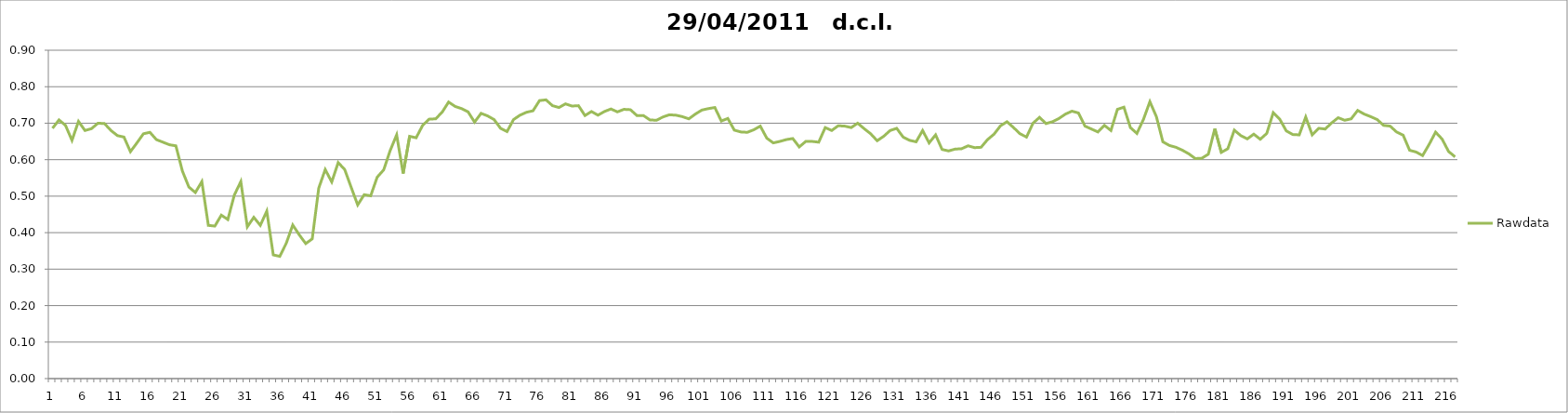
| Category | Rawdata |
|---|---|
| 0 | 0.686 |
| 1 | 0.709 |
| 2 | 0.694 |
| 3 | 0.653 |
| 4 | 0.705 |
| 5 | 0.68 |
| 6 | 0.685 |
| 7 | 0.7 |
| 8 | 0.699 |
| 9 | 0.68 |
| 10 | 0.666 |
| 11 | 0.662 |
| 12 | 0.622 |
| 13 | 0.646 |
| 14 | 0.671 |
| 15 | 0.675 |
| 16 | 0.655 |
| 17 | 0.648 |
| 18 | 0.641 |
| 19 | 0.638 |
| 20 | 0.569 |
| 21 | 0.525 |
| 22 | 0.51 |
| 23 | 0.54 |
| 24 | 0.42 |
| 25 | 0.418 |
| 26 | 0.448 |
| 27 | 0.436 |
| 28 | 0.503 |
| 29 | 0.54 |
| 30 | 0.416 |
| 31 | 0.442 |
| 32 | 0.42 |
| 33 | 0.459 |
| 34 | 0.339 |
| 35 | 0.335 |
| 36 | 0.371 |
| 37 | 0.421 |
| 38 | 0.394 |
| 39 | 0.37 |
| 40 | 0.383 |
| 41 | 0.522 |
| 42 | 0.573 |
| 43 | 0.539 |
| 44 | 0.592 |
| 45 | 0.573 |
| 46 | 0.524 |
| 47 | 0.476 |
| 48 | 0.504 |
| 49 | 0.501 |
| 50 | 0.552 |
| 51 | 0.572 |
| 52 | 0.625 |
| 53 | 0.668 |
| 54 | 0.562 |
| 55 | 0.664 |
| 56 | 0.66 |
| 57 | 0.694 |
| 58 | 0.711 |
| 59 | 0.712 |
| 60 | 0.73 |
| 61 | 0.758 |
| 62 | 0.746 |
| 63 | 0.74 |
| 64 | 0.731 |
| 65 | 0.703 |
| 66 | 0.727 |
| 67 | 0.72 |
| 68 | 0.71 |
| 69 | 0.686 |
| 70 | 0.677 |
| 71 | 0.71 |
| 72 | 0.722 |
| 73 | 0.73 |
| 74 | 0.734 |
| 75 | 0.762 |
| 76 | 0.764 |
| 77 | 0.748 |
| 78 | 0.743 |
| 79 | 0.753 |
| 80 | 0.747 |
| 81 | 0.748 |
| 82 | 0.721 |
| 83 | 0.732 |
| 84 | 0.722 |
| 85 | 0.732 |
| 86 | 0.739 |
| 87 | 0.731 |
| 88 | 0.738 |
| 89 | 0.737 |
| 90 | 0.721 |
| 91 | 0.721 |
| 92 | 0.709 |
| 93 | 0.708 |
| 94 | 0.717 |
| 95 | 0.723 |
| 96 | 0.722 |
| 97 | 0.718 |
| 98 | 0.712 |
| 99 | 0.725 |
| 100 | 0.736 |
| 101 | 0.74 |
| 102 | 0.743 |
| 103 | 0.706 |
| 104 | 0.713 |
| 105 | 0.681 |
| 106 | 0.676 |
| 107 | 0.675 |
| 108 | 0.682 |
| 109 | 0.692 |
| 110 | 0.659 |
| 111 | 0.646 |
| 112 | 0.65 |
| 113 | 0.655 |
| 114 | 0.658 |
| 115 | 0.635 |
| 116 | 0.65 |
| 117 | 0.65 |
| 118 | 0.648 |
| 119 | 0.688 |
| 120 | 0.68 |
| 121 | 0.693 |
| 122 | 0.692 |
| 123 | 0.688 |
| 124 | 0.7 |
| 125 | 0.685 |
| 126 | 0.671 |
| 127 | 0.652 |
| 128 | 0.664 |
| 129 | 0.68 |
| 130 | 0.686 |
| 131 | 0.662 |
| 132 | 0.653 |
| 133 | 0.649 |
| 134 | 0.68 |
| 135 | 0.646 |
| 136 | 0.668 |
| 137 | 0.628 |
| 138 | 0.624 |
| 139 | 0.629 |
| 140 | 0.63 |
| 141 | 0.638 |
| 142 | 0.633 |
| 143 | 0.634 |
| 144 | 0.655 |
| 145 | 0.67 |
| 146 | 0.693 |
| 147 | 0.704 |
| 148 | 0.688 |
| 149 | 0.671 |
| 150 | 0.662 |
| 151 | 0.7 |
| 152 | 0.716 |
| 153 | 0.699 |
| 154 | 0.704 |
| 155 | 0.713 |
| 156 | 0.725 |
| 157 | 0.733 |
| 158 | 0.728 |
| 159 | 0.692 |
| 160 | 0.684 |
| 161 | 0.676 |
| 162 | 0.694 |
| 163 | 0.68 |
| 164 | 0.738 |
| 165 | 0.744 |
| 166 | 0.688 |
| 167 | 0.672 |
| 168 | 0.71 |
| 169 | 0.759 |
| 170 | 0.718 |
| 171 | 0.649 |
| 172 | 0.639 |
| 173 | 0.634 |
| 174 | 0.626 |
| 175 | 0.616 |
| 176 | 0.603 |
| 177 | 0.604 |
| 178 | 0.615 |
| 179 | 0.685 |
| 180 | 0.62 |
| 181 | 0.63 |
| 182 | 0.681 |
| 183 | 0.666 |
| 184 | 0.657 |
| 185 | 0.67 |
| 186 | 0.656 |
| 187 | 0.672 |
| 188 | 0.729 |
| 189 | 0.711 |
| 190 | 0.679 |
| 191 | 0.669 |
| 192 | 0.668 |
| 193 | 0.717 |
| 194 | 0.668 |
| 195 | 0.686 |
| 196 | 0.684 |
| 197 | 0.701 |
| 198 | 0.715 |
| 199 | 0.708 |
| 200 | 0.712 |
| 201 | 0.735 |
| 202 | 0.725 |
| 203 | 0.718 |
| 204 | 0.71 |
| 205 | 0.694 |
| 206 | 0.692 |
| 207 | 0.676 |
| 208 | 0.667 |
| 209 | 0.626 |
| 210 | 0.621 |
| 211 | 0.611 |
| 212 | 0.642 |
| 213 | 0.676 |
| 214 | 0.656 |
| 215 | 0.622 |
| 216 | 0.608 |